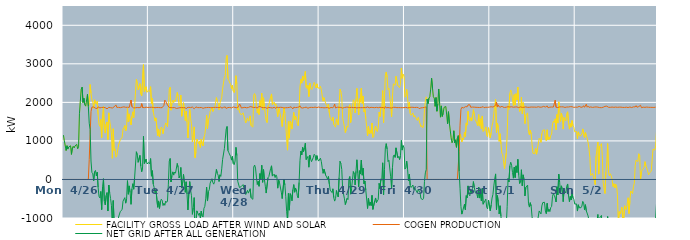
| Category | FACILITY GROSS LOAD AFTER WIND AND SOLAR | COGEN PRODUCTION | NET GRID AFTER ALL GENERATION |
|---|---|---|---|
|  Mon  4/26 | 1149 | 0 | 1149 |
|  Mon  4/26 | 1004 | 0 | 1004 |
|  Mon  4/26 | 990 | 0 | 990 |
|  Mon  4/26 | 752 | 0 | 752 |
|  Mon  4/26 | 875 | 0 | 875 |
|  Mon  4/26 | 788 | 0 | 788 |
|  Mon  4/26 | 843 | 0 | 843 |
|  Mon  4/26 | 820 | 0 | 820 |
|  Mon  4/26 | 873 | 0 | 873 |
|  Mon  4/26 | 650 | 0 | 650 |
|  Mon  4/26 | 821 | 0 | 821 |
|  Mon  4/26 | 860 | 0 | 860 |
|  Mon  4/26 | 818 | 0 | 818 |
|  Mon  4/26 | 871 | 0 | 871 |
|  Mon  4/26 | 871 | 0 | 871 |
|  Mon  4/26 | 909 | 0 | 909 |
|  Mon  4/26 | 795 | 0 | 795 |
|  Mon  4/26 | 845 | 0 | 845 |
|  Mon  4/26 | 1704 | 0 | 1704 |
|  Mon  4/26 | 2029 | 0 | 2029 |
|  Mon  4/26 | 2341 | 0 | 2341 |
|  Mon  4/26 | 2396 | 0 | 2396 |
|  Mon  4/26 | 1997 | 0 | 1997 |
|  Mon  4/26 | 2105 | 0 | 2105 |
|  Mon  4/26 | 1941 | 0 | 1941 |
|  Mon  4/26 | 1902 | 0 | 1902 |
|  Mon  4/26 | 1897 | 0 | 1897 |
|  Mon  4/26 | 2207 | 0 | 2207 |
|  Mon  4/26 | 1895 | 0 | 1895 |
|  Mon  4/26 | 1977 | 517 | 1460 |
|  Mon  4/26 | 2463 | 1163 | 1300 |
|  Mon  4/26 | 2237 | 1759 | 478 |
|  Mon  4/26 | 2062 | 1878 | 184 |
|  Mon  4/26 | 2011 | 1864 | 147 |
|  Mon  4/26 | 1846 | 1879 | -33 |
|  Mon  4/26 | 2066 | 1866 | 200 |
|  Mon  4/26 | 2083 | 1849 | 234 |
|  Mon  4/26 | 1954 | 1861 | 93 |
|  Mon  4/26 | 2028 | 1840 | 188 |
|  Mon  4/26 | 1680 | 1884 | -204 |
|  Mon  4/26 | 1433 | 1871 | -438 |
|  Mon  4/26 | 1378 | 1857 | -479 |
|  Mon  4/26 | 1558 | 1869 | -311 |
|  Mon  4/26 | 1087 | 1868 | -781 |
|  Mon  4/26 | 1681 | 1872 | -191 |
|  Mon  4/26 | 1890 | 1870 | 20 |
|  Mon  4/26 | 1294 | 1860 | -566 |
|  Mon  4/26 | 1203 | 1863 | -660 |
|  Mon  4/26 | 1436 | 1852 | -416 |
|  Mon  4/26 | 1492 | 1832 | -340 |
|  Mon  4/26 | 1038 | 1857 | -819 |
|  Mon  4/26 | 1728 | 1872 | -144 |
|  Mon  4/26 | 1513 | 1859 | -346 |
|  Mon  4/26 | 1367 | 1863 | -496 |
|  Mon  4/26 | 1179 | 1861 | -682 |
|  Mon  4/26 | 550 | 1853 | -1303 |
|  Mon  4/26 | 1315 | 1862 | -547 |
|  Mon  4/26 | 752 | 1884 | -1132 |
|  Mon  4/26 | 795 | 1870 | -1075 |
|  Mon  4/26 | 578 | 1934 | -1356 |
|  Mon  4/26 | 618 | 1870 | -1252 |
|  Mon  4/26 | 640 | 1864 | -1224 |
|  Mon  4/26 | 895 | 1870 | -975 |
|  Mon  4/26 | 902 | 1853 | -951 |
|  Mon  4/26 | 1034 | 1862 | -828 |
|  Mon  4/26 | 1034 | 1864 | -830 |
|  Mon  4/26 | 1092 | 1874 | -782 |
|  Mon  4/26 | 1310 | 1873 | -563 |
|  Mon  4/26 | 1337 | 1883 | -546 |
|  Mon  4/26 | 1401 | 1873 | -472 |
|  Mon  4/26 | 1257 | 1872 | -615 |
|  Mon  4/26 | 1357 | 1857 | -500 |
|  Mon  4/26 | 1842 | 1873 | -31 |
|  Mon  4/26 | 1493 | 1877 | -384 |
|  Mon  4/26 | 1701 | 1868 | -167 |
|  Mon  4/26 | 1520 | 1861 | -341 |
|  Mon  4/26 | 1415 | 2060 | -645 |
|  Mon  4/26 | 1642 | 1889 | -247 |
|  Mon  4/26 | 1754 | 1865 | -111 |
|  Mon  4/26 | 1603 | 1856 | -253 |
|  Mon  4/26 | 1899 | 1863 | 36 |
|  Mon  4/26 | 1911 | 1860 | 51 |
|  Mon  4/26 | 2596 | 1877 | 719 |
|  Mon  4/26 | 2506 | 1866 | 640 |
|  Mon  4/26 | 2324 | 1880 | 444 |
|  Mon  4/26 | 2301 | 1862 | 439 |
|  Mon  4/26 | 2484 | 1862 | 622 |
|  Mon  4/26 | 2215 | 1870 | 345 |
|  Mon  4/26 | 2168 | 1967 | 201 |
|  Mon  4/26 | 2190 | 1867 | 323 |
|  Mon  4/26 | 2978 | 1861 | 1117 |
|  Mon  4/26 | 2277 | 1863 | 414 |
|  Mon  4/26 | 2271 | 1859 | 412 |
|  Mon  4/26 | 2405 | 1875 | 530 |
|  Mon  4/26 | 2263 | 1858 | 405 |
|  Mon  4/26 | 2267 | 1867 | 400 |
|  Tue  4/27 | 2309 | 1872 | 437 |
|  Tue  4/27 | 2279 | 1870 | 409 |
|  Tue  4/27 | 2407 | 1865 | 542 |
|  Tue  4/27 | 1958 | 1873 | 85 |
|  Tue  4/27 | 2099 | 1871 | 228 |
|  Tue  4/27 | 1748 | 1869 | -121 |
|  Tue  4/27 | 1640 | 1848 | -208 |
|  Tue  4/27 | 1515 | 1860 | -345 |
|  Tue  4/27 | 1597 | 1860 | -263 |
|  Tue  4/27 | 1582 | 1868 | -286 |
|  Tue  4/27 | 1131 | 1852 | -721 |
|  Tue  4/27 | 1310 | 1867 | -557 |
|  Tue  4/27 | 1104 | 1856 | -752 |
|  Tue  4/27 | 1279 | 1862 | -583 |
|  Tue  4/27 | 1359 | 1872 | -513 |
|  Tue  4/27 | 1324 | 1863 | -539 |
|  Tue  4/27 | 1187 | 1864 | -677 |
|  Tue  4/27 | 1306 | 1922 | -616 |
|  Tue  4/27 | 1386 | 2057 | -671 |
|  Tue  4/27 | 1467 | 2027 | -560 |
|  Tue  4/27 | 1436 | 2031 | -595 |
|  Tue  4/27 | 1369 | 1932 | -563 |
|  Tue  4/27 | 1828 | 1950 | -122 |
|  Tue  4/27 | 2341 | 1866 | 475 |
|  Tue  4/27 | 2391 | 1847 | 544 |
|  Tue  4/27 | 1797 | 1863 | -66 |
|  Tue  4/27 | 1973 | 1870 | 103 |
|  Tue  4/27 | 2059 | 1862 | 197 |
|  Tue  4/27 | 1989 | 1876 | 113 |
|  Tue  4/27 | 2057 | 1865 | 192 |
|  Tue  4/27 | 2026 | 1864 | 162 |
|  Tue  4/27 | 2014 | 1844 | 170 |
|  Tue  4/27 | 2257 | 1842 | 415 |
|  Tue  4/27 | 2162 | 1852 | 310 |
|  Tue  4/27 | 1907 | 1868 | 39 |
|  Tue  4/27 | 1955 | 1863 | 92 |
|  Tue  4/27 | 2189 | 1877 | 312 |
|  Tue  4/27 | 1640 | 1864 | -224 |
|  Tue  4/27 | 1803 | 1875 | -72 |
|  Tue  4/27 | 1994 | 1862 | 132 |
|  Tue  4/27 | 1766 | 1855 | -89 |
|  Tue  4/27 | 1528 | 1862 | -334 |
|  Tue  4/27 | 1774 | 1834 | -60 |
|  Tue  4/27 | 1484 | 1863 | -379 |
|  Tue  4/27 | 1077 | 1869 | -792 |
|  Tue  4/27 | 1500 | 1872 | -372 |
|  Tue  4/27 | 1827 | 1882 | -55 |
|  Tue  4/27 | 1585 | 1864 | -279 |
|  Tue  4/27 | 1447 | 1870 | -423 |
|  Tue  4/27 | 973 | 1878 | -905 |
|  Tue  4/27 | 1138 | 1873 | -735 |
|  Tue  4/27 | 1364 | 1835 | -471 |
|  Tue  4/27 | 565 | 1857 | -1292 |
|  Tue  4/27 | 720 | 1882 | -1162 |
|  Tue  4/27 | 1050 | 1865 | -815 |
|  Tue  4/27 | 994 | 1863 | -869 |
|  Tue  4/27 | 930 | 1860 | -930 |
|  Tue  4/27 | 992 | 1864 | -872 |
|  Tue  4/27 | 830 | 1851 | -1021 |
|  Tue  4/27 | 1047 | 1868 | -821 |
|  Tue  4/27 | 927 | 1871 | -944 |
|  Tue  4/27 | 870 | 1846 | -976 |
|  Tue  4/27 | 1091 | 1839 | -748 |
|  Tue  4/27 | 1164 | 1861 | -697 |
|  Tue  4/27 | 1369 | 1873 | -504 |
|  Tue  4/27 | 1668 | 1865 | -197 |
|  Tue  4/27 | 1315 | 1875 | -560 |
|  Tue  4/27 | 1552 | 1868 | -316 |
|  Tue  4/27 | 1594 | 1860 | -266 |
|  Tue  4/27 | 1770 | 1865 | -95 |
|  Tue  4/27 | 1806 | 1880 | -74 |
|  Tue  4/27 | 1880 | 1861 | 19 |
|  Tue  4/27 | 1763 | 1842 | -79 |
|  Tue  4/27 | 1747 | 1869 | -122 |
|  Tue  4/27 | 1839 | 1891 | -52 |
|  Tue  4/27 | 1836 | 1870 | -34 |
|  Tue  4/27 | 2124 | 1862 | 262 |
|  Tue  4/27 | 2024 | 1869 | 155 |
|  Tue  4/27 | 1976 | 1865 | 111 |
|  Tue  4/27 | 1810 | 1863 | -53 |
|  Tue  4/27 | 1981 | 1859 | 122 |
|  Tue  4/27 | 1963 | 1882 | 81 |
|  Tue  4/27 | 2125 | 1849 | 276 |
|  Tue  4/27 | 2354 | 1832 | 522 |
|  Tue  4/27 | 2372 | 1871 | 501 |
|  Tue  4/27 | 2653 | 1850 | 803 |
|  Tue  4/27 | 2692 | 1881 | 811 |
|  Tue  4/27 | 3147 | 1842 | 1305 |
|  Tue  4/27 | 3218 | 1844 | 1374 |
|  Tue  4/27 | 2614 | 1866 | 748 |
|  Tue  4/27 | 2564 | 1870 | 694 |
|  Tue  4/27 | 2547 | 1868 | 679 |
|  Tue  4/27 | 2462 | 1866 | 596 |
|  Tue  4/27 | 2358 | 1856 | 502 |
|  Tue  4/27 | 2442 | 1845 | 597 |
|  Tue  4/27 | 2290 | 1881 | 409 |
|  Wed  4/28 | 2251 | 1868 | 383 |
|  Wed  4/28 | 2348 | 1869 | 479 |
|  Wed  4/28 | 2692 | 1859 | 833 |
|  Wed  4/28 | 2479 | 1860 | 619 |
|  Wed  4/28 | 1806 | 1852 | -46 |
|  Wed  4/28 | 1862 | 1888 | -26 |
|  Wed  4/28 | 1744 | 1956 | -212 |
|  Wed  4/28 | 1729 | 1929 | -200 |
|  Wed  4/28 | 1673 | 1855 | -182 |
|  Wed  4/28 | 1650 | 1856 | -206 |
|  Wed  4/28 | 1728 | 1862 | -134 |
|  Wed  4/28 | 1749 | 1864 | -115 |
|  Wed  4/28 | 1554 | 1871 | -317 |
|  Wed  4/28 | 1464 | 1855 | -391 |
|  Wed  4/28 | 1481 | 1859 | -378 |
|  Wed  4/28 | 1596 | 1879 | -283 |
|  Wed  4/28 | 1512 | 1867 | -355 |
|  Wed  4/28 | 1540 | 1879 | -339 |
|  Wed  4/28 | 1649 | 1890 | -241 |
|  Wed  4/28 | 1397 | 1871 | -474 |
|  Wed  4/28 | 1422 | 1880 | -458 |
|  Wed  4/28 | 1359 | 1874 | -515 |
|  Wed  4/28 | 2187 | 1865 | 322 |
|  Wed  4/28 | 2229 | 1856 | 373 |
|  Wed  4/28 | 2167 | 1872 | 295 |
|  Wed  4/28 | 1931 | 1869 | 62 |
|  Wed  4/28 | 1723 | 1853 | -130 |
|  Wed  4/28 | 1834 | 1882 | -48 |
|  Wed  4/28 | 1684 | 1861 | -177 |
|  Wed  4/28 | 2045 | 1892 | 153 |
|  Wed  4/28 | 1886 | 1881 | 5 |
|  Wed  4/28 | 2235 | 1868 | 367 |
|  Wed  4/28 | 1801 | 1875 | -74 |
|  Wed  4/28 | 2119 | 1863 | 256 |
|  Wed  4/28 | 1870 | 1869 | 1 |
|  Wed  4/28 | 1691 | 1866 | -175 |
|  Wed  4/28 | 1525 | 1878 | -353 |
|  Wed  4/28 | 1477 | 1845 | -368 |
|  Wed  4/28 | 1907 | 1864 | 43 |
|  Wed  4/28 | 1945 | 1870 | 75 |
|  Wed  4/28 | 1956 | 1870 | 86 |
|  Wed  4/28 | 2144 | 1862 | 282 |
|  Wed  4/28 | 2219 | 1865 | 354 |
|  Wed  4/28 | 1942 | 1855 | 87 |
|  Wed  4/28 | 1935 | 1860 | 75 |
|  Wed  4/28 | 2008 | 1870 | 138 |
|  Wed  4/28 | 1918 | 1869 | 49 |
|  Wed  4/28 | 1964 | 1845 | 119 |
|  Wed  4/28 | 1943 | 1876 | 67 |
|  Wed  4/28 | 1629 | 1855 | -226 |
|  Wed  4/28 | 1850 | 1866 | -16 |
|  Wed  4/28 | 1776 | 1861 | -85 |
|  Wed  4/28 | 1786 | 1872 | -86 |
|  Wed  4/28 | 1544 | 1873 | -329 |
|  Wed  4/28 | 1373 | 1869 | -496 |
|  Wed  4/28 | 1350 | 1861 | -511 |
|  Wed  4/28 | 1860 | 1854 | 6 |
|  Wed  4/28 | 1724 | 1867 | -143 |
|  Wed  4/28 | 1425 | 1861 | -436 |
|  Wed  4/28 | 1048 | 1872 | -824 |
|  Wed  4/28 | 760 | 1862 | -1102 |
|  Wed  4/28 | 1499 | 1862 | -363 |
|  Wed  4/28 | 1072 | 1869 | -797 |
|  Wed  4/28 | 1517 | 1885 | -368 |
|  Wed  4/28 | 1471 | 1885 | -414 |
|  Wed  4/28 | 1308 | 1862 | -554 |
|  Wed  4/28 | 1566 | 1830 | -264 |
|  Wed  4/28 | 1740 | 1874 | -134 |
|  Wed  4/28 | 1542 | 1873 | -331 |
|  Wed  4/28 | 1644 | 1865 | -221 |
|  Wed  4/28 | 1607 | 1879 | -272 |
|  Wed  4/28 | 1449 | 1870 | -421 |
|  Wed  4/28 | 1395 | 1873 | -478 |
|  Wed  4/28 | 1803 | 1880 | -77 |
|  Wed  4/28 | 2401 | 1911 | 490 |
|  Wed  4/28 | 2598 | 1863 | 735 |
|  Wed  4/28 | 2498 | 1860 | 638 |
|  Wed  4/28 | 2685 | 1853 | 832 |
|  Wed  4/28 | 2568 | 1844 | 724 |
|  Wed  4/28 | 2692 | 1866 | 826 |
|  Wed  4/28 | 2803 | 1863 | 940 |
|  Wed  4/28 | 2389 | 1875 | 514 |
|  Wed  4/28 | 2361 | 1861 | 500 |
|  Wed  4/28 | 2446 | 1848 | 598 |
|  Wed  4/28 | 2152 | 1834 | 318 |
|  Wed  4/28 | 2500 | 1868 | 632 |
|  Wed  4/28 | 2381 | 1848 | 533 |
|  Wed  4/28 | 2332 | 1870 | 462 |
|  Wed  4/28 | 2338 | 1853 | 485 |
|  Wed  4/28 | 2439 | 1866 | 573 |
|  Wed  4/28 | 2519 | 1866 | 653 |
|  Wed  4/28 | 2504 | 1877 | 627 |
|  Wed  4/28 | 2374 | 1878 | 496 |
|  Wed  4/28 | 2481 | 1863 | 618 |
|  Wed  4/28 | 2378 | 1854 | 524 |
|  Wed  4/28 | 2355 | 1879 | 476 |
|  Thu  4/29 | 2363 | 1871 | 492 |
|  Thu  4/29 | 2416 | 1864 | 552 |
|  Thu  4/29 | 2334 | 1868 | 466 |
|  Thu  4/29 | 2168 | 1865 | 303 |
|  Thu  4/29 | 2031 | 1871 | 160 |
|  Thu  4/29 | 2124 | 1858 | 266 |
|  Thu  4/29 | 2132 | 1859 | 273 |
|  Thu  4/29 | 1965 | 1862 | 103 |
|  Thu  4/29 | 1922 | 1858 | 64 |
|  Thu  4/29 | 1870 | 1864 | 6 |
|  Thu  4/29 | 1952 | 1874 | 78 |
|  Thu  4/29 | 1730 | 1847 | -117 |
|  Thu  4/29 | 1593 | 1870 | -277 |
|  Thu  4/29 | 1583 | 1869 | -286 |
|  Thu  4/29 | 1525 | 1865 | -340 |
|  Thu  4/29 | 1617 | 1859 | -242 |
|  Thu  4/29 | 1425 | 1896 | -471 |
|  Thu  4/29 | 1394 | 1956 | -562 |
|  Thu  4/29 | 1357 | 1854 | -497 |
|  Thu  4/29 | 1572 | 1859 | -287 |
|  Thu  4/29 | 1482 | 1874 | -392 |
|  Thu  4/29 | 1411 | 1866 | -455 |
|  Thu  4/29 | 1919 | 1872 | 47 |
|  Thu  4/29 | 2344 | 1874 | 470 |
|  Thu  4/29 | 2281 | 1868 | 413 |
|  Thu  4/29 | 2126 | 1867 | 259 |
|  Thu  4/29 | 1596 | 1852 | -256 |
|  Thu  4/29 | 1591 | 1848 | -257 |
|  Thu  4/29 | 1362 | 1866 | -504 |
|  Thu  4/29 | 1216 | 1868 | -652 |
|  Thu  4/29 | 1225 | 1875 | -650 |
|  Thu  4/29 | 1383 | 1873 | -490 |
|  Thu  4/29 | 1356 | 1876 | -520 |
|  Thu  4/29 | 1890 | 1882 | 8 |
|  Thu  4/29 | 1938 | 1862 | 76 |
|  Thu  4/29 | 1478 | 1859 | -381 |
|  Thu  4/29 | 1634 | 1871 | -237 |
|  Thu  4/29 | 1611 | 1872 | -261 |
|  Thu  4/29 | 2068 | 1863 | 205 |
|  Thu  4/29 | 2018 | 1874 | 144 |
|  Thu  4/29 | 1726 | 1868 | -142 |
|  Thu  4/29 | 2090 | 1877 | 213 |
|  Thu  4/29 | 2365 | 1855 | 510 |
|  Thu  4/29 | 2024 | 1852 | 172 |
|  Thu  4/29 | 1675 | 1864 | -189 |
|  Thu  4/29 | 2094 | 1867 | 227 |
|  Thu  4/29 | 2003 | 1863 | 140 |
|  Thu  4/29 | 2368 | 1866 | 502 |
|  Thu  4/29 | 1972 | 1862 | 110 |
|  Thu  4/29 | 2162 | 1869 | 293 |
|  Thu  4/29 | 1752 | 1864 | -112 |
|  Thu  4/29 | 1818 | 1858 | -40 |
|  Thu  4/29 | 1587 | 1863 | -276 |
|  Thu  4/29 | 1371 | 1878 | -507 |
|  Thu  4/29 | 1127 | 1881 | -754 |
|  Thu  4/29 | 1386 | 1868 | -482 |
|  Thu  4/29 | 1187 | 1859 | -672 |
|  Thu  4/29 | 1274 | 1862 | -588 |
|  Thu  4/29 | 1194 | 1871 | -677 |
|  Thu  4/29 | 1465 | 1878 | -413 |
|  Thu  4/29 | 1089 | 1866 | -777 |
|  Thu  4/29 | 1115 | 1885 | -770 |
|  Thu  4/29 | 1303 | 1862 | -559 |
|  Thu  4/29 | 1386 | 1866 | -480 |
|  Thu  4/29 | 1268 | 1870 | -602 |
|  Thu  4/29 | 1242 | 1869 | -627 |
|  Thu  4/29 | 1344 | 1860 | -516 |
|  Thu  4/29 | 1748 | 1848 | -100 |
|  Thu  4/29 | 1631 | 1873 | -242 |
|  Thu  4/29 | 1878 | 1863 | 15 |
|  Thu  4/29 | 1843 | 1865 | -22 |
|  Thu  4/29 | 2305 | 1873 | 432 |
|  Thu  4/29 | 1474 | 1869 | -395 |
|  Thu  4/29 | 2095 | 1843 | 252 |
|  Thu  4/29 | 2707 | 1890 | 817 |
|  Thu  4/29 | 2788 | 1859 | 929 |
|  Thu  4/29 | 2650 | 1862 | 788 |
|  Thu  4/29 | 2329 | 1866 | 463 |
|  Thu  4/29 | 2369 | 1870 | 499 |
|  Thu  4/29 | 2364 | 1859 | 505 |
|  Thu  4/29 | 1934 | 1864 | 70 |
|  Thu  4/29 | 1623 | 1854 | -231 |
|  Thu  4/29 | 2165 | 1861 | 304 |
|  Thu  4/29 | 2480 | 1871 | 609 |
|  Thu  4/29 | 2497 | 1861 | 636 |
|  Thu  4/29 | 2444 | 1872 | 572 |
|  Thu  4/29 | 2678 | 1858 | 820 |
|  Thu  4/29 | 2702 | 1863 | 839 |
|  Thu  4/29 | 2437 | 1874 | 563 |
|  Thu  4/29 | 2460 | 1864 | 596 |
|  Thu  4/29 | 2382 | 1867 | 515 |
|  Thu  4/29 | 2482 | 1863 | 619 |
|  Thu  4/29 | 2888 | 1874 | 1014 |
|  Thu  4/29 | 2624 | 1862 | 762 |
|  Thu  4/29 | 2729 | 1850 | 879 |
|  Thu  4/29 | 2687 | 1863 | 824 |
|  Fri  4/30 | 2133 | 1865 | 268 |
|  Fri  4/30 | 2174 | 1873 | 301 |
|  Fri  4/30 | 2336 | 1860 | 476 |
|  Fri  4/30 | 2120 | 1857 | 263 |
|  Fri  4/30 | 1840 | 1871 | -31 |
|  Fri  4/30 | 2002 | 1865 | 137 |
|  Fri  4/30 | 1711 | 1865 | -154 |
|  Fri  4/30 | 1665 | 1873 | -208 |
|  Fri  4/30 | 1678 | 1874 | -196 |
|  Fri  4/30 | 1726 | 1871 | -145 |
|  Fri  4/30 | 1621 | 1881 | -260 |
|  Fri  4/30 | 1658 | 1867 | -209 |
|  Fri  4/30 | 1606 | 1872 | -266 |
|  Fri  4/30 | 1582 | 1870 | -288 |
|  Fri  4/30 | 1530 | 1874 | -344 |
|  Fri  4/30 | 1612 | 1866 | -254 |
|  Fri  4/30 | 1536 | 1838 | -302 |
|  Fri  4/30 | 1516 | 1858 | -342 |
|  Fri  4/30 | 1364 | 1857 | -493 |
|  Fri  4/30 | 1398 | 1866 | -468 |
|  Fri  4/30 | 1339 | 1862 | -523 |
|  Fri  4/30 | 1382 | 1868 | -486 |
|  Fri  4/30 | 1811 | 1869 | -58 |
|  Fri  4/30 | 2031 | 1860 | 171 |
|  Fri  4/30 | 2143 | 1883 | 260 |
|  Fri  4/30 | 2083 | 0 | 2083 |
|  Fri  4/30 | 1968 | 0 | 1968 |
|  Fri  4/30 | 2106 | 0 | 2106 |
|  Fri  4/30 | 2143 | 0 | 2143 |
|  Fri  4/30 | 2345 | 0 | 2345 |
|  Fri  4/30 | 2627 | 0 | 2627 |
|  Fri  4/30 | 2372 | 0 | 2372 |
|  Fri  4/30 | 2145 | 0 | 2145 |
|  Fri  4/30 | 2112 | 0 | 2112 |
|  Fri  4/30 | 1896 | 0 | 1896 |
|  Fri  4/30 | 2125 | 0 | 2125 |
|  Fri  4/30 | 1770 | 0 | 1770 |
|  Fri  4/30 | 1960 | 0 | 1960 |
|  Fri  4/30 | 2347 | 0 | 2347 |
|  Fri  4/30 | 1984 | 0 | 1984 |
|  Fri  4/30 | 1616 | 0 | 1616 |
|  Fri  4/30 | 1908 | 0 | 1908 |
|  Fri  4/30 | 1635 | 0 | 1635 |
|  Fri  4/30 | 1714 | 0 | 1714 |
|  Fri  4/30 | 1870 | 0 | 1870 |
|  Fri  4/30 | 1864 | 0 | 1864 |
|  Fri  4/30 | 1893 | 0 | 1893 |
|  Fri  4/30 | 1673 | 0 | 1673 |
|  Fri  4/30 | 1443 | 0 | 1443 |
|  Fri  4/30 | 1757 | 0 | 1757 |
|  Fri  4/30 | 1464 | 0 | 1464 |
|  Fri  4/30 | 1452 | 0 | 1452 |
|  Fri  4/30 | 1081 | 0 | 1081 |
|  Fri  4/30 | 950 | 0 | 950 |
|  Fri  4/30 | 1002 | 0 | 1002 |
|  Fri  4/30 | 1263 | 0 | 1263 |
|  Fri  4/30 | 951 | 0 | 951 |
|  Fri  4/30 | 1028 | 0 | 1028 |
|  Fri  4/30 | 834 | 0 | 834 |
|  Fri  4/30 | 1068 | 0 | 1068 |
|  Fri  4/30 | 1138 | 0 | 1138 |
|  Fri  4/30 | 934 | 724 | 210 |
|  Fri  4/30 | 1180 | 1408 | -228 |
|  Fri  4/30 | 1112 | 1815 | -703 |
|  Fri  4/30 | 971 | 1870 | -899 |
|  Fri  4/30 | 1068 | 1885 | -817 |
|  Fri  4/30 | 1037 | 1857 | -820 |
|  Fri  4/30 | 1230 | 1872 | -642 |
|  Fri  4/30 | 1103 | 1888 | -785 |
|  Fri  4/30 | 1467 | 1888 | -421 |
|  Fri  4/30 | 1410 | 1885 | -475 |
|  Fri  4/30 | 1767 | 1934 | -167 |
|  Fri  4/30 | 1556 | 1940 | -384 |
|  Fri  4/30 | 1512 | 1937 | -425 |
|  Fri  4/30 | 1600 | 1873 | -273 |
|  Fri  4/30 | 1515 | 1858 | -343 |
|  Fri  4/30 | 1644 | 1878 | -234 |
|  Fri  4/30 | 1813 | 1868 | -55 |
|  Fri  4/30 | 1677 | 1875 | -198 |
|  Fri  4/30 | 1556 | 1887 | -331 |
|  Fri  4/30 | 1512 | 1872 | -360 |
|  Fri  4/30 | 1490 | 1879 | -389 |
|  Fri  4/30 | 1392 | 1869 | -477 |
|  Fri  4/30 | 1681 | 1880 | -199 |
|  Fri  4/30 | 1384 | 1867 | -483 |
|  Fri  4/30 | 1576 | 1888 | -312 |
|  Fri  4/30 | 1317 | 1871 | -554 |
|  Fri  4/30 | 1647 | 1879 | -232 |
|  Fri  4/30 | 1246 | 1889 | -643 |
|  Fri  4/30 | 1242 | 1861 | -619 |
|  Fri  4/30 | 1296 | 1854 | -558 |
|  Fri  4/30 | 1363 | 1873 | -510 |
|  Fri  4/30 | 1150 | 1869 | -719 |
|  Fri  4/30 | 1108 | 1871 | -763 |
|  Fri  4/30 | 1344 | 1878 | -534 |
|  Fri  4/30 | 1350 | 1877 | -527 |
|  Sat  5/1 | 1077 | 1889 | -812 |
|  Sat  5/1 | 1222 | 1885 | -663 |
|  Sat  5/1 | 1393 | 1875 | -482 |
|  Sat  5/1 | 1489 | 1878 | -389 |
|  Sat  5/1 | 1715 | 1883 | -168 |
|  Sat  5/1 | 1911 | 1902 | 9 |
|  Sat  5/1 | 2077 | 1933 | 144 |
|  Sat  5/1 | 1218 | 2005 | -787 |
|  Sat  5/1 | 1461 | 1878 | -417 |
|  Sat  5/1 | 1355 | 1933 | -578 |
|  Sat  5/1 | 988 | 1883 | -895 |
|  Sat  5/1 | 1187 | 1869 | -682 |
|  Sat  5/1 | 923 | 1877 | -954 |
|  Sat  5/1 | 680 | 1905 | -1225 |
|  Sat  5/1 | 641 | 1879 | -1238 |
|  Sat  5/1 | 640 | 1866 | -1226 |
|  Sat  5/1 | 279 | 1868 | -1589 |
|  Sat  5/1 | 275 | 1869 | -1594 |
|  Sat  5/1 | 689 | 1875 | -1186 |
|  Sat  5/1 | 1166 | 1872 | -706 |
|  Sat  5/1 | 1911 | 1886 | 25 |
|  Sat  5/1 | 1818 | 1882 | -64 |
|  Sat  5/1 | 2229 | 1879 | 350 |
|  Sat  5/1 | 2323 | 1876 | 447 |
|  Sat  5/1 | 2257 | 1885 | 372 |
|  Sat  5/1 | 2060 | 1880 | 180 |
|  Sat  5/1 | 1907 | 1874 | 33 |
|  Sat  5/1 | 2201 | 1882 | 319 |
|  Sat  5/1 | 1927 | 1879 | 48 |
|  Sat  5/1 | 2226 | 1873 | 353 |
|  Sat  5/1 | 2061 | 1882 | 179 |
|  Sat  5/1 | 2393 | 1872 | 521 |
|  Sat  5/1 | 1983 | 1864 | 119 |
|  Sat  5/1 | 1760 | 1870 | -110 |
|  Sat  5/1 | 1804 | 1883 | -79 |
|  Sat  5/1 | 2138 | 1886 | 252 |
|  Sat  5/1 | 1704 | 1869 | -165 |
|  Sat  5/1 | 1995 | 1875 | 120 |
|  Sat  5/1 | 1866 | 1874 | -8 |
|  Sat  5/1 | 1448 | 1876 | -428 |
|  Sat  5/1 | 1680 | 1882 | -202 |
|  Sat  5/1 | 1690 | 1890 | -200 |
|  Sat  5/1 | 1723 | 1871 | -148 |
|  Sat  5/1 | 1237 | 1869 | -632 |
|  Sat  5/1 | 1155 | 1872 | -717 |
|  Sat  5/1 | 1276 | 1879 | -603 |
|  Sat  5/1 | 1183 | 1879 | -696 |
|  Sat  5/1 | 904 | 1871 | -967 |
|  Sat  5/1 | 680 | 1877 | -1197 |
|  Sat  5/1 | 661 | 1878 | -1217 |
|  Sat  5/1 | 670 | 1877 | -1207 |
|  Sat  5/1 | 803 | 1881 | -1078 |
|  Sat  5/1 | 655 | 1873 | -1218 |
|  Sat  5/1 | 780 | 1883 | -1103 |
|  Sat  5/1 | 801 | 1887 | -1086 |
|  Sat  5/1 | 1066 | 1883 | -817 |
|  Sat  5/1 | 1040 | 1874 | -834 |
|  Sat  5/1 | 963 | 1858 | -895 |
|  Sat  5/1 | 1190 | 1877 | -687 |
|  Sat  5/1 | 1274 | 1875 | -601 |
|  Sat  5/1 | 1289 | 1896 | -607 |
|  Sat  5/1 | 1288 | 1880 | -592 |
|  Sat  5/1 | 1060 | 1878 | -818 |
|  Sat  5/1 | 1005 | 1893 | -888 |
|  Sat  5/1 | 1288 | 1907 | -619 |
|  Sat  5/1 | 1030 | 1860 | -830 |
|  Sat  5/1 | 1104 | 1875 | -771 |
|  Sat  5/1 | 1041 | 1876 | -835 |
|  Sat  5/1 | 1141 | 1871 | -730 |
|  Sat  5/1 | 1180 | 1879 | -699 |
|  Sat  5/1 | 1437 | 1872 | -435 |
|  Sat  5/1 | 1512 | 1878 | -366 |
|  Sat  5/1 | 1479 | 1891 | -412 |
|  Sat  5/1 | 1574 | 2055 | -481 |
|  Sat  5/1 | 1286 | 1871 | -585 |
|  Sat  5/1 | 1684 | 1873 | -189 |
|  Sat  5/1 | 1463 | 1864 | -401 |
|  Sat  5/1 | 2013 | 1874 | 139 |
|  Sat  5/1 | 1812 | 1883 | -71 |
|  Sat  5/1 | 1506 | 1872 | -366 |
|  Sat  5/1 | 1718 | 1884 | -166 |
|  Sat  5/1 | 1615 | 1872 | -257 |
|  Sat  5/1 | 1307 | 1883 | -576 |
|  Sat  5/1 | 1607 | 1872 | -265 |
|  Sat  5/1 | 1556 | 1868 | -312 |
|  Sat  5/1 | 1521 | 1871 | -350 |
|  Sat  5/1 | 1704 | 1879 | -175 |
|  Sat  5/1 | 1756 | 1873 | -117 |
|  Sat  5/1 | 1455 | 1880 | -425 |
|  Sat  5/1 | 1306 | 1883 | -577 |
|  Sat  5/1 | 1449 | 1889 | -440 |
|  Sat  5/1 | 1358 | 1887 | -529 |
|  Sat  5/1 | 1528 | 1887 | -359 |
|  Sat  5/1 | 1393 | 1872 | -479 |
|  Sat  5/1 | 1352 | 1870 | -518 |
|  Sat  5/1 | 1234 | 1873 | -639 |
|  Sun  5/2 | 1227 | 1876 | -649 |
|  Sun  5/2 | 1248 | 1883 | -635 |
|  Sun  5/2 | 1054 | 1874 | -820 |
|  Sun  5/2 | 1235 | 1892 | -657 |
|  Sun  5/2 | 1164 | 1897 | -733 |
|  Sun  5/2 | 1123 | 1875 | -752 |
|  Sun  5/2 | 1138 | 1872 | -734 |
|  Sun  5/2 | 1181 | 1873 | -692 |
|  Sun  5/2 | 1312 | 1880 | -568 |
|  Sun  5/2 | 1306 | 1913 | -607 |
|  Sun  5/2 | 1087 | 1872 | -785 |
|  Sun  5/2 | 1217 | 1872 | -655 |
|  Sun  5/2 | 1138 | 1952 | -814 |
|  Sun  5/2 | 1069 | 1874 | -805 |
|  Sun  5/2 | 955 | 1902 | -947 |
|  Sun  5/2 | 796 | 1870 | -1074 |
|  Sun  5/2 | 572 | 1870 | -1298 |
|  Sun  5/2 | 101 | 1881 | -1780 |
|  Sun  5/2 | 105 | 1865 | -1760 |
|  Sun  5/2 | 156 | 1869 | -1713 |
|  Sun  5/2 | 75 | 1871 | -1796 |
|  Sun  5/2 | 99 | 1877 | -1778 |
|  Sun  5/2 | -135 | 1880 | -2015 |
|  Sun  5/2 | 602 | 1882 | -1280 |
|  Sun  5/2 | 788 | 1871 | -1083 |
|  Sun  5/2 | 967 | 1876 | -909 |
|  Sun  5/2 | 138 | 1881 | -1743 |
|  Sun  5/2 | 864 | 1864 | -1000 |
|  Sun  5/2 | 891 | 1876 | -985 |
|  Sun  5/2 | 930 | 1862 | -932 |
|  Sun  5/2 | 624 | 1884 | -1260 |
|  Sun  5/2 | -86 | 1874 | -1960 |
|  Sun  5/2 | -239 | 1874 | -2113 |
|  Sun  5/2 | -364 | 1896 | -2260 |
|  Sun  5/2 | 192 | 1874 | -1682 |
|  Sun  5/2 | 422 | 1902 | -1480 |
|  Sun  5/2 | 931 | 1891 | -960 |
|  Sun  5/2 | 192 | 1872 | -1680 |
|  Sun  5/2 | 94 | 1874 | -1780 |
|  Sun  5/2 | 147 | 1871 | -1724 |
|  Sun  5/2 | 97 | 1890 | -1793 |
|  Sun  5/2 | 2 | 1878 | -1876 |
|  Sun  5/2 | -182 | 1865 | -2047 |
|  Sun  5/2 | -111 | 1871 | -1982 |
|  Sun  5/2 | -222 | 1880 | -2102 |
|  Sun  5/2 | -121 | 1878 | -1999 |
|  Sun  5/2 | -156 | 1867 | -2023 |
|  Sun  5/2 | -387 | 1871 | -2258 |
|  Sun  5/2 | -1148 | 1889 | -3037 |
|  Sun  5/2 | -835 | 1876 | -2711 |
|  Sun  5/2 | -892 | 1874 | -2766 |
|  Sun  5/2 | -888 | 1876 | -2764 |
|  Sun  5/2 | -720 | 1878 | -2598 |
|  Sun  5/2 | -1002 | 1869 | -2871 |
|  Sun  5/2 | -1065 | 1860 | -2925 |
|  Sun  5/2 | -683 | 1868 | -2551 |
|  Sun  5/2 | -737 | 1864 | -2601 |
|  Sun  5/2 | -782 | 1875 | -2657 |
|  Sun  5/2 | -630 | 1888 | -2518 |
|  Sun  5/2 | -475 | 1865 | -2340 |
|  Sun  5/2 | -884 | 1853 | -2737 |
|  Sun  5/2 | -549 | 1880 | -2429 |
|  Sun  5/2 | -299 | 1875 | -2174 |
|  Sun  5/2 | -282 | 1865 | -2147 |
|  Sun  5/2 | -367 | 1880 | -2247 |
|  Sun  5/2 | -191 | 1883 | -2074 |
|  Sun  5/2 | -97 | 1871 | -1968 |
|  Sun  5/2 | 364 | 1882 | -1518 |
|  Sun  5/2 | 503 | 1914 | -1411 |
|  Sun  5/2 | 483 | 1873 | -1390 |
|  Sun  5/2 | 465 | 1882 | -1417 |
|  Sun  5/2 | 669 | 1891 | -1222 |
|  Sun  5/2 | 632 | 1880 | -1248 |
|  Sun  5/2 | 1 | 1925 | -1924 |
|  Sun  5/2 | 197 | 1862 | -1665 |
|  Sun  5/2 | 253 | 1876 | -1623 |
|  Sun  5/2 | 263 | 1875 | -1612 |
|  Sun  5/2 | 311 | 1869 | -1558 |
|  Sun  5/2 | 461 | 1871 | -1410 |
|  Sun  5/2 | 355 | 1883 | -1528 |
|  Sun  5/2 | 291 | 1878 | -1587 |
|  Sun  5/2 | 224 | 1878 | -1654 |
|  Sun  5/2 | 120 | 1872 | -1752 |
|  Sun  5/2 | 169 | 1881 | -1712 |
|  Sun  5/2 | 186 | 1871 | -1685 |
|  Sun  5/2 | 211 | 1878 | -1667 |
|  Sun  5/2 | 223 | 1870 | -1647 |
|  Sun  5/2 | 784 | 1882 | -1098 |
|  Sun  5/2 | 769 | 1868 | -1099 |
|  Sun  5/2 | 762 | 1884 | -1122 |
|  Sun  5/2 | 870 | 1876 | -1006 |
|  Sun  5/2 | 1270 | 1874 | -604 |